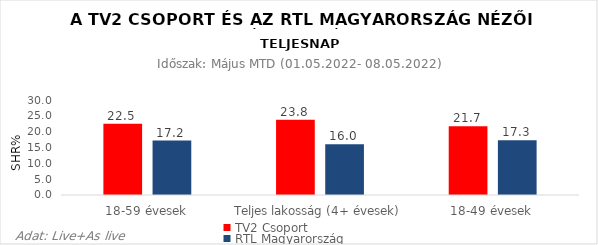
| Category | TV2 Csoport | RTL Magyarország |
|---|---|---|
| 18-59 évesek | 22.5 | 17.2 |
| Teljes lakosság (4+ évesek) | 23.8 | 16 |
| 18-49 évesek | 21.7 | 17.3 |